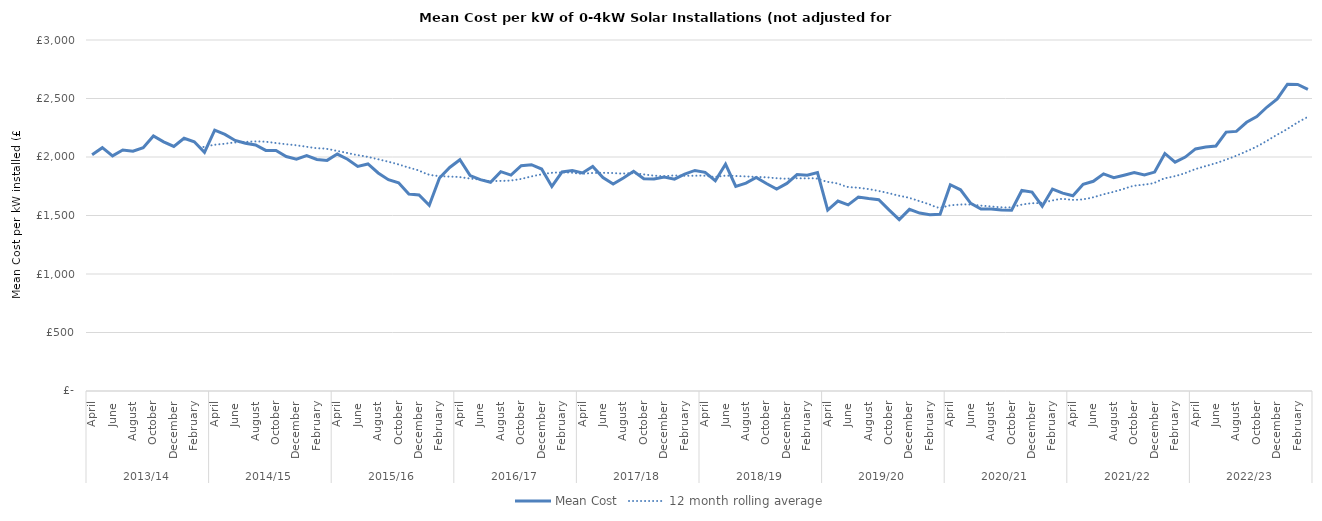
| Category | Mean Cost |
|---|---|
| 0 | 2020 |
| 1 | 2080 |
| 2 | 2010 |
| 3 | 2060 |
| 4 | 2050 |
| 5 | 2080 |
| 6 | 2180 |
| 7 | 2130 |
| 8 | 2090 |
| 9 | 2160 |
| 10 | 2130 |
| 11 | 2040 |
| 12 | 2228.885 |
| 13 | 2193.375 |
| 14 | 2141.286 |
| 15 | 2117.478 |
| 16 | 2102.559 |
| 17 | 2056.035 |
| 18 | 2056.575 |
| 19 | 2004.174 |
| 20 | 1981.718 |
| 21 | 2011.545 |
| 22 | 1978.963 |
| 23 | 1971.204 |
| 24 | 2025.128 |
| 25 | 1981.429 |
| 26 | 1919.979 |
| 27 | 1940.453 |
| 28 | 1863.267 |
| 29 | 1806.136 |
| 30 | 1779.593 |
| 31 | 1683.997 |
| 32 | 1676.038 |
| 33 | 1586.684 |
| 34 | 1820.474 |
| 35 | 1910.681 |
| 36 | 1977.081 |
| 37 | 1841.332 |
| 38 | 1806.948 |
| 39 | 1784.506 |
| 40 | 1874.633 |
| 41 | 1844.766 |
| 42 | 1925.217 |
| 43 | 1933.935 |
| 44 | 1896.952 |
| 45 | 1748.772 |
| 46 | 1872.449 |
| 47 | 1884.917 |
| 48 | 1863.57 |
| 49 | 1919.65 |
| 50 | 1823.71 |
| 51 | 1768.33 |
| 52 | 1820.94 |
| 53 | 1878.28 |
| 54 | 1814.51 |
| 55 | 1811.9 |
| 56 | 1829.29 |
| 57 | 1810.6 |
| 58 | 1853.71 |
| 59 | 1885.04 |
| 60 | 1868.917 |
| 61 | 1797.706 |
| 62 | 1938.616 |
| 63 | 1748.085 |
| 64 | 1776.491 |
| 65 | 1825.651 |
| 66 | 1773.046 |
| 67 | 1725.936 |
| 68 | 1774.031 |
| 69 | 1849.818 |
| 70 | 1844.856 |
| 71 | 1867.252 |
| 72 | 1546.739 |
| 73 | 1623.168 |
| 74 | 1591.138 |
| 75 | 1657.783 |
| 76 | 1644.524 |
| 77 | 1635.236 |
| 78 | 1547.859 |
| 79 | 1465.383 |
| 80 | 1552.805 |
| 81 | 1520.831 |
| 82 | 1506.177 |
| 83 | 1510.954 |
| 84 | 1762.799 |
| 85 | 1719.613 |
| 86 | 1603.455 |
| 87 | 1556.026 |
| 88 | 1555.991 |
| 89 | 1546.313 |
| 90 | 1545.384 |
| 91 | 1713.963 |
| 92 | 1700.597 |
| 93 | 1579.191 |
| 94 | 1726.096 |
| 95 | 1691.414 |
| 96 | 1668.261 |
| 97 | 1766.896 |
| 98 | 1792.425 |
| 99 | 1855.571 |
| 100 | 1823.568 |
| 101 | 1844.591 |
| 102 | 1866.529 |
| 103 | 1845.92 |
| 104 | 1871.105 |
| 105 | 2030.139 |
| 106 | 1955.526 |
| 107 | 1999.511 |
| 108 | 2069.015 |
| 109 | 2085.124 |
| 110 | 2094.237 |
| 111 | 2212.696 |
| 112 | 2219 |
| 113 | 2296.613 |
| 114 | 2344.895 |
| 115 | 2427.145 |
| 116 | 2495.967 |
| 117 | 2622.44 |
| 118 | 2619.97 |
| 119 | 2577.562 |